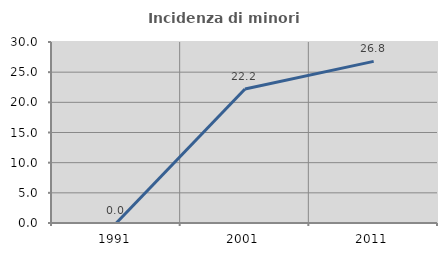
| Category | Incidenza di minori stranieri |
|---|---|
| 1991.0 | 0 |
| 2001.0 | 22.222 |
| 2011.0 | 26.786 |